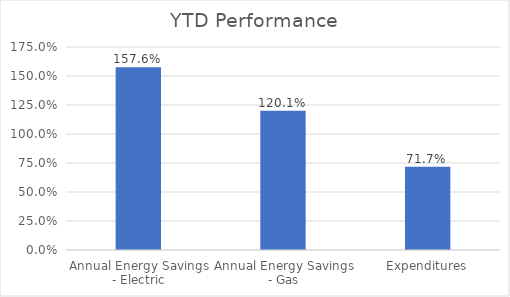
| Category | Series 0 |
|---|---|
| Annual Energy Savings - Electric | 1.576 |
| Annual Energy Savings - Gas | 1.201 |
| Expenditures | 0.717 |